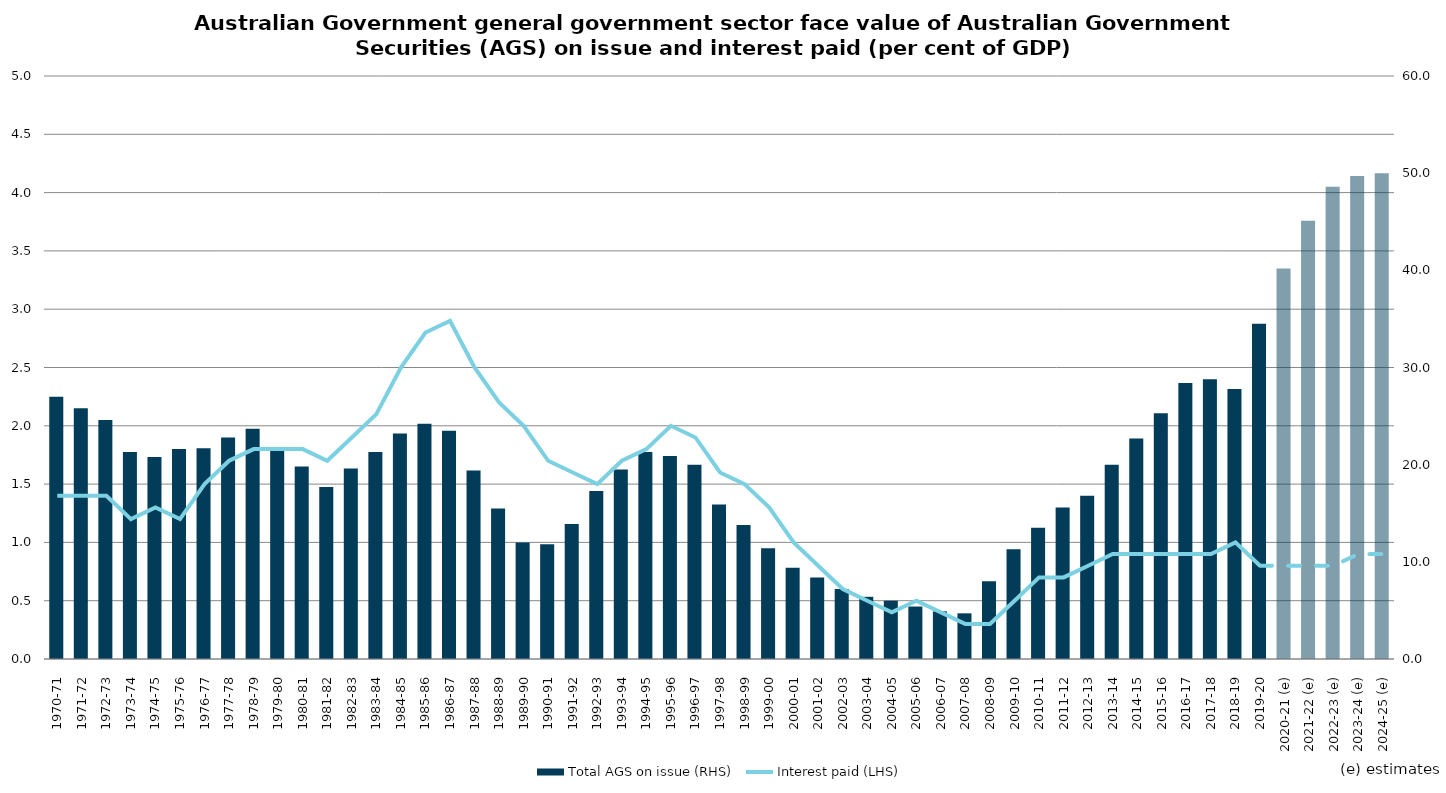
| Category | Total AGS on issue (RHS) |
|---|---|
| 1970-71 | 27 |
| 1971-72 | 25.8 |
| 1972-73 | 24.6 |
| 1973-74 | 21.3 |
| 1974-75 | 20.8 |
| 1975-76 | 21.6 |
| 1976-77 | 21.7 |
| 1977-78 | 22.8 |
| 1978-79 | 23.7 |
| 1979-80 | 21.8 |
| 1980-81 | 19.8 |
| 1981-82 | 17.7 |
| 1982-83 | 19.6 |
| 1983-84 | 21.3 |
| 1984-85 | 23.2 |
| 1985-86 | 24.2 |
| 1986-87 | 23.5 |
| 1987-88 | 19.4 |
| 1988-89 | 15.5 |
| 1989-90 | 12 |
| 1990-91 | 11.8 |
| 1991-92 | 13.9 |
| 1992-93 | 17.3 |
| 1993-94 | 19.5 |
| 1994-95 | 21.3 |
| 1995-96 | 20.9 |
| 1996-97 | 20 |
| 1997-98 | 15.9 |
| 1998-99 | 13.8 |
| 1999-00 | 11.4 |
| 2000-01 | 9.4 |
| 2001-02 | 8.4 |
| 2002-03 | 7.2 |
| 2003-04 | 6.4 |
| 2004-05 | 6 |
| 2005-06 | 5.4 |
| 2006-07 | 4.9 |
| 2007-08 | 4.7 |
| 2008-09 | 8 |
| 2009-10 | 11.3 |
| 2010-11 | 13.5 |
| 2011-12 | 15.6 |
| 2012-13 | 16.8 |
| 2013-14 | 20 |
| 2014-15 | 22.7 |
| 2015-16 | 25.3 |
| 2016-17 | 28.4 |
| 2017-18 | 28.8 |
| 2018-19 | 27.8 |
| 2019-20 | 34.5 |
| 2020-21 (e) | 40.2 |
| 2021-22 (e) | 45.1 |
| 2022-23 (e) | 48.6 |
| 2023-24 (e) | 49.7 |